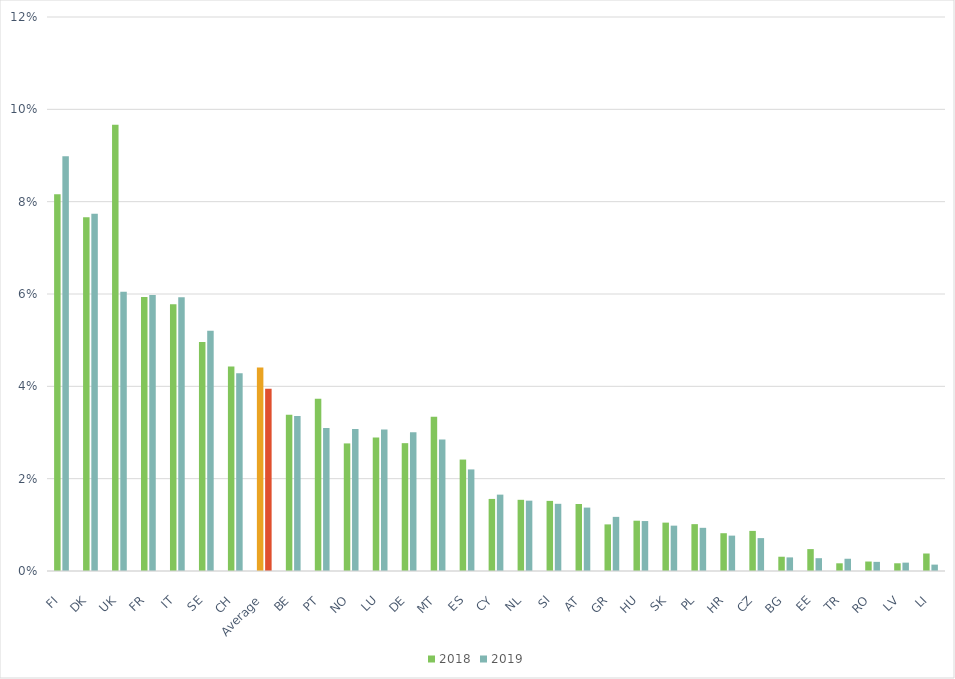
| Category | 2018 | 2019 |
|---|---|---|
| FI | 0.082 | 0.09 |
| DK | 0.077 | 0.077 |
| UK | 0.097 | 0.061 |
| FR | 0.059 | 0.06 |
| IT | 0.058 | 0.059 |
| SE | 0.05 | 0.052 |
| CH | 0.044 | 0.043 |
| Average | 0.044 | 0.039 |
| BE | 0.034 | 0.034 |
| PT | 0.037 | 0.031 |
| NO | 0.028 | 0.031 |
| LU | 0.029 | 0.031 |
| DE | 0.028 | 0.03 |
| MT | 0.033 | 0.028 |
| ES | 0.024 | 0.022 |
| CY | 0.016 | 0.017 |
| NL | 0.015 | 0.015 |
| SI | 0.015 | 0.015 |
| AT | 0.015 | 0.014 |
| GR | 0.01 | 0.012 |
| HU | 0.011 | 0.011 |
| SK | 0.01 | 0.01 |
| PL | 0.01 | 0.009 |
| HR | 0.008 | 0.008 |
| CZ | 0.009 | 0.007 |
| BG | 0.003 | 0.003 |
| EE | 0.005 | 0.003 |
| TR | 0.002 | 0.003 |
| RO | 0.002 | 0.002 |
| LV | 0.002 | 0.002 |
| LI | 0.004 | 0.001 |